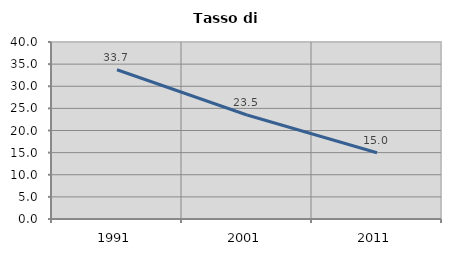
| Category | Tasso di disoccupazione   |
|---|---|
| 1991.0 | 33.733 |
| 2001.0 | 23.506 |
| 2011.0 | 14.981 |